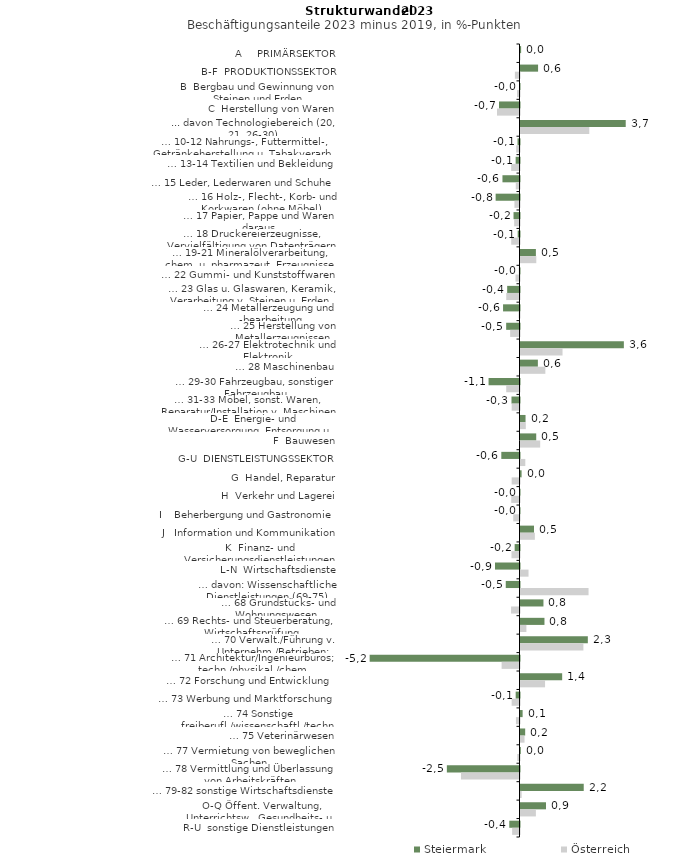
| Category | Steiermark | Österreich |
|---|---|---|
| A     PRIMÄRSEKTOR | 0.022 | -0.007 |
| B-F  PRODUKTIONSSEKTOR | 0.612 | -0.161 |
| B  Bergbau und Gewinnung von Steinen und Erden | -0.009 | -0.086 |
| C  Herstellung von Waren | -0.714 | -0.782 |
| ... davon Technologiebereich (20, 21, 26-30) | 3.66 | 2.393 |
| … 10-12 Nahrungs-, Futtermittel-, Getränkeherstellung u. Tabakverarb. | -0.068 | -0.116 |
| … 13-14 Textilien und Bekleidung | -0.134 | -0.289 |
| … 15 Leder, Lederwaren und Schuhe | -0.593 | -0.13 |
| … 16 Holz-, Flecht-, Korb- und Korkwaren (ohne Möbel)  | -0.83 | -0.177 |
| … 17 Papier, Pappe und Waren daraus  | -0.208 | -0.185 |
| … 18 Druckereierzeugnisse, Vervielfältigung von Datenträgern | -0.063 | -0.288 |
| … 19-21 Mineralölverarbeitung, chem. u. pharmazeut. Erzeugnisse | 0.535 | 0.549 |
| … 22 Gummi- und Kunststoffwaren | -0.02 | -0.139 |
| … 23 Glas u. Glaswaren, Keramik, Verarbeitung v. Steinen u. Erden  | -0.429 | -0.462 |
| … 24 Metallerzeugung und -bearbeitung | -0.572 | -0.032 |
| … 25 Herstellung von Metallerzeugnissen  | -0.464 | -0.325 |
| … 26-27 Elektrotechnik und Elektronik | 3.595 | 1.462 |
| … 28 Maschinenbau | 0.604 | 0.864 |
| … 29-30 Fahrzeugbau, sonstiger Fahrzeugbau | -1.076 | -0.462 |
| … 31-33 Möbel, sonst. Waren, Reparatur/Installation v. Maschinen | -0.279 | -0.273 |
| D-E  Energie- und Wasserversorgung, Entsorgung u. Rückgewinnung | 0.175 | 0.184 |
| F  Bauwesen | 0.547 | 0.684 |
| G-U  DIENSTLEISTUNGSSEKTOR | -0.633 | 0.167 |
| G  Handel, Reparatur | 0.038 | -0.273 |
| H  Verkehr und Lagerei | -0.011 | -0.287 |
| I    Beherbergung und Gastronomie | -0.007 | -0.218 |
| J   Information und Kommunikation | 0.471 | 0.499 |
| K  Finanz- und Versicherungsdienstleistungen | -0.168 | -0.279 |
| L-N  Wirtschaftsdienste | -0.853 | 0.279 |
| … davon: Wissenschaftliche Dienstleistungen (69-75) | -0.478 | 2.367 |
| … 68 Grundstücks- und Wohnungswesen  | 0.798 | -0.294 |
| … 69 Rechts- und Steuerberatung, Wirtschaftsprüfung | 0.834 | 0.205 |
| … 70 Verwalt./Führung v. Unternehm./Betrieben; Unternehmensberat. | 2.342 | 2.188 |
| … 71 Architektur/Ingenieurbüros; techn./physikal./chem. Untersuchung | -5.212 | -0.622 |
| … 72 Forschung und Entwicklung  | 1.449 | 0.854 |
| … 73 Werbung und Marktforschung | -0.133 | -0.273 |
| … 74 Sonstige freiberufl./wissenschaftl./techn. Tätigkeiten | 0.074 | -0.124 |
| … 75 Veterinärwesen | 0.163 | 0.14 |
| … 77 Vermietung von beweglichen Sachen  | 0.011 | -0.077 |
| … 78 Vermittlung und Überlassung von Arbeitskräften | -2.527 | -2.035 |
| … 79-82 sonstige Wirtschaftsdienste | 2.199 | 0.039 |
| O-Q Öffent. Verwaltung, Unterrichtsw., Gesundheits- u. Sozialwesen | 0.886 | 0.535 |
| R-U  sonstige Dienstleistungen | -0.355 | -0.256 |